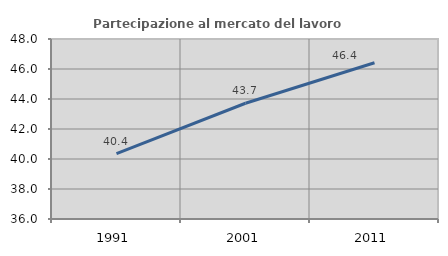
| Category | Partecipazione al mercato del lavoro  femminile |
|---|---|
| 1991.0 | 40.362 |
| 2001.0 | 43.716 |
| 2011.0 | 46.42 |